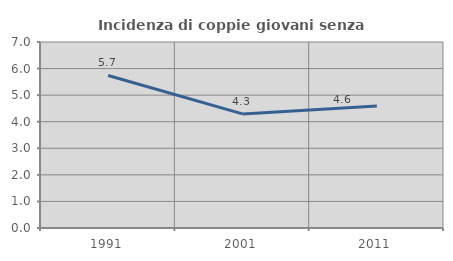
| Category | Incidenza di coppie giovani senza figli |
|---|---|
| 1991.0 | 5.739 |
| 2001.0 | 4.293 |
| 2011.0 | 4.591 |